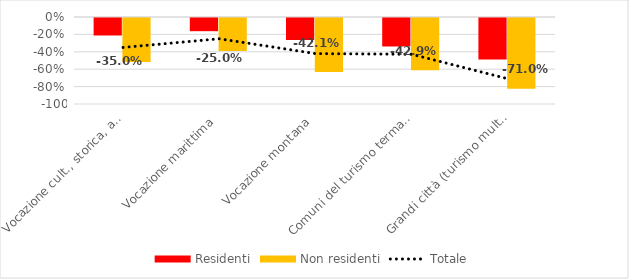
| Category | Residenti | Non residenti |
|---|---|---|
| Vocazione cult., storica, artistica e paes. | -0.201 | -0.505 |
| Vocazione marittima | -0.152 | -0.379 |
| Vocazione montana | -0.253 | -0.622 |
| Comuni del turismo termale | -0.327 | -0.599 |
| Grandi città (turismo multidimensionale) | -0.478 | -0.814 |